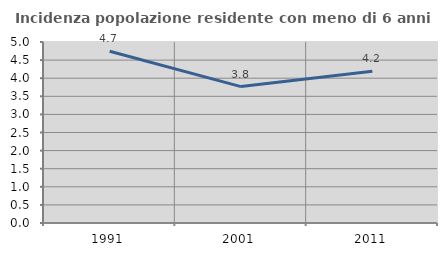
| Category | Incidenza popolazione residente con meno di 6 anni |
|---|---|
| 1991.0 | 4.745 |
| 2001.0 | 3.768 |
| 2011.0 | 4.195 |